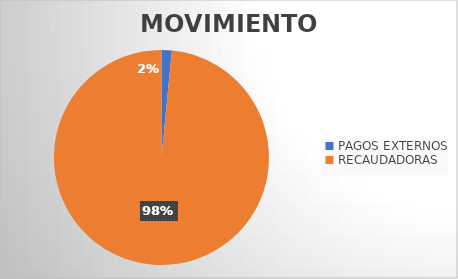
| Category | MOVIMIENTOS |
|---|---|
| PAGOS EXTERNOS | 310 |
| RECAUDADORAS | 19754 |